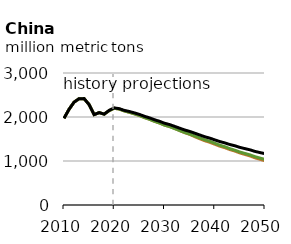
| Category | EAC | DAC | Reference |
|---|---|---|---|
| 2010.0 | 1970.668 | 1970.668 | 1970.668 |
| 2011.0 | 2174.21 | 2174.21 | 2174.21 |
| 2012.0 | 2336.399 | 2336.399 | 2336.399 |
| 2013.0 | 2416.373 | 2416.373 | 2416.373 |
| 2014.0 | 2417.783 | 2417.783 | 2417.783 |
| 2015.0 | 2281.673 | 2281.673 | 2281.673 |
| 2016.0 | 2054.524 | 2054.524 | 2054.524 |
| 2017.0 | 2099.577 | 2099.577 | 2099.577 |
| 2018.0 | 2065.037 | 2065.037 | 2065.037 |
| 2019.0 | 2144.371 | 2144.371 | 2151.042 |
| 2020.0 | 2198.108 | 2198.104 | 2206.893 |
| 2021.0 | 2180.362 | 2180.343 | 2189.368 |
| 2022.0 | 2137.948 | 2137.736 | 2150.66 |
| 2023.0 | 2107.308 | 2107.041 | 2125.19 |
| 2024.0 | 2071.811 | 2071.471 | 2093.741 |
| 2025.0 | 2034.026 | 2033.602 | 2059.371 |
| 2026.0 | 1987.854 | 1987.332 | 2016.864 |
| 2027.0 | 1949.546 | 1948.906 | 1981.592 |
| 2028.0 | 1902.787 | 1902.013 | 1938.258 |
| 2029.0 | 1864.494 | 1863.551 | 1902.764 |
| 2030.0 | 1816.953 | 1814.926 | 1858.482 |
| 2031.0 | 1784.947 | 1782.01 | 1828.442 |
| 2032.0 | 1741.134 | 1737.682 | 1787.894 |
| 2033.0 | 1692.485 | 1693.05 | 1746.62 |
| 2034.0 | 1645.554 | 1648.165 | 1705.511 |
| 2035.0 | 1605.942 | 1612.307 | 1673.295 |
| 2036.0 | 1554.111 | 1569.134 | 1632.946 |
| 2037.0 | 1506.508 | 1525.464 | 1592.183 |
| 2038.0 | 1461.517 | 1481.88 | 1551.614 |
| 2039.0 | 1425.855 | 1448.04 | 1520.088 |
| 2040.0 | 1381.481 | 1403.692 | 1480.555 |
| 2041.0 | 1337.371 | 1359.315 | 1441.517 |
| 2042.0 | 1303.02 | 1324.674 | 1412.029 |
| 2043.0 | 1259.888 | 1280.485 | 1374.528 |
| 2044.0 | 1226.049 | 1245.343 | 1346.093 |
| 2045.0 | 1183.046 | 1203.628 | 1309.241 |
| 2046.0 | 1149.404 | 1171.668 | 1281.577 |
| 2047.0 | 1115.69 | 1139.741 | 1254.153 |
| 2048.0 | 1072.768 | 1098.356 | 1218.275 |
| 2049.0 | 1039.331 | 1066.919 | 1191.816 |
| 2050.0 | 1005.962 | 1035.679 | 1165.81 |